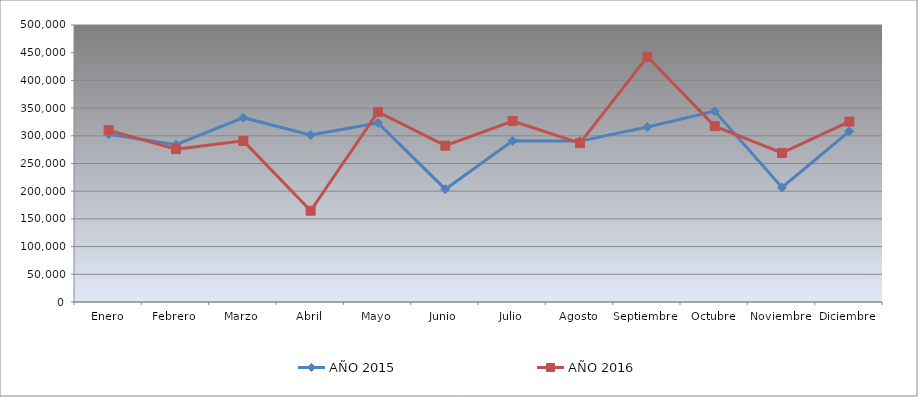
| Category | AÑO 2015 | AÑO 2016 |
|---|---|---|
| Enero | 302960 | 310270 |
| Febrero | 284040 | 275820 |
| Marzo | 332720 | 290820 |
| Abril | 301400 | 164740 |
| Mayo | 323280 | 343190 |
| Junio | 203640 | 282180 |
| Julio | 290880 | 326650 |
| Agosto | 290400 | 286790 |
| Septiembre | 315760 | 442630 |
| Octubre | 344560 | 317480 |
| Noviembre | 206720 | 269130 |
| Diciembre | 307910 | 325620 |